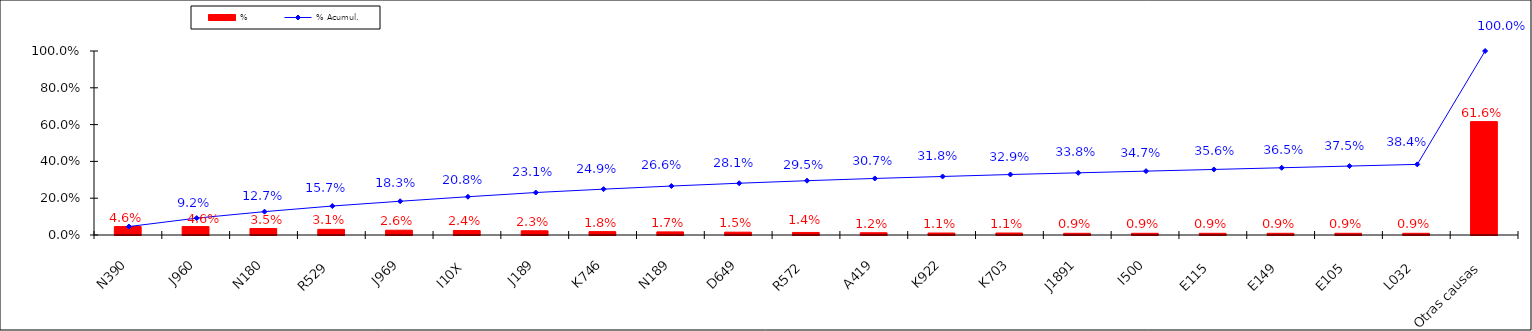
| Category | % |
|---|---|
| N390 | 0.046 |
| J960 | 0.046 |
| N180 | 0.035 |
| R529 | 0.031 |
| J969 | 0.026 |
| I10X | 0.024 |
| J189 | 0.023 |
| K746 | 0.018 |
| N189 | 0.017 |
| D649 | 0.015 |
| R572 | 0.014 |
| A419 | 0.012 |
| K922 | 0.011 |
| K703 | 0.011 |
| J1891 | 0.009 |
| I500 | 0.009 |
| E115 | 0.009 |
| E149 | 0.009 |
| E105 | 0.009 |
| L032 | 0.009 |
| Otras causas | 0.616 |